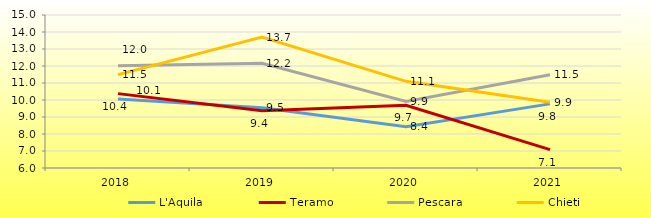
| Category | L'Aquila | Teramo | Pescara | Chieti |
|---|---|---|---|---|
| 2018 | 10.066 | 10.375 | 12.016 | 11.493 |
| 2019 | 9.549 | 9.365 | 12.156 | 13.699 |
| 2020 | 8.423 | 9.689 | 9.92 | 11.099 |
| 2021 | 9.773 | 7.079 | 11.483 | 9.874 |